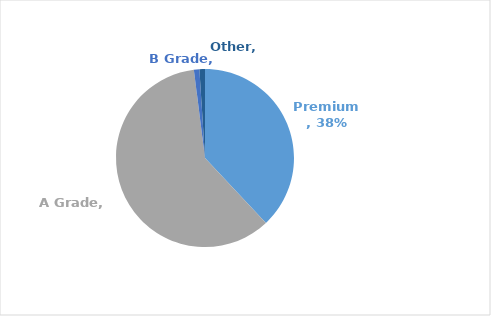
| Category | Series 0 |
|---|---|
| Premium | 0.38 |
| A Grade | 0.6 |
| B Grade | 0.01 |
| Other | 0.01 |